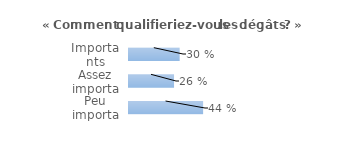
| Category | Series 0 |
|---|---|
| Importants | 0.298 |
| Assez importants | 0.265 |
| Peu importants | 0.436 |